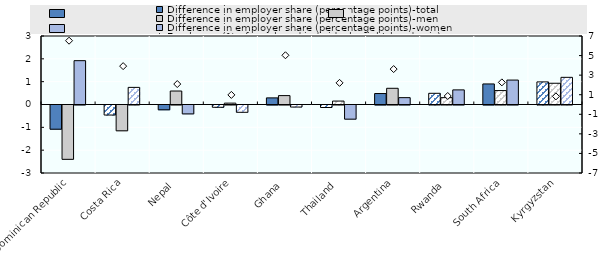
| Category | Difference in employer share (percentage points)-total | Difference in employer share (percentage points)-men | Difference in employer share (percentage points)-women |
|---|---|---|---|
| Dominican Republic | -1.06 | -2.38 | 1.92 |
| Costa Rica | -0.44 | -1.13 | 0.75 |
| Nepal | -0.21 | 0.59 | -0.39 |
| Côte d'Ivoire | -0.1 | 0.06 | -0.32 |
| Ghana | 0.29 | 0.39 | -0.09 |
| Thailand | -0.11 | 0.15 | -0.62 |
| Argentina | 0.48 | 0.71 | 0.3 |
| Rwanda | 0.49 | 0.3 | 0.64 |
| South Africa | 0.9 | 0.61 | 1.07 |
| Kyrgyzstan | 0.99 | 0.93 | 1.19 |